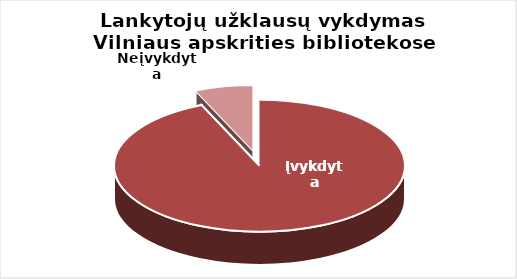
| Category | Series 0 |
|---|---|
| Įvykdyta | 396067 |
| Neįvykdyta | 27573 |